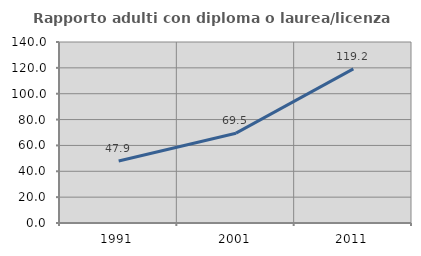
| Category | Rapporto adulti con diploma o laurea/licenza media  |
|---|---|
| 1991.0 | 47.893 |
| 2001.0 | 69.468 |
| 2011.0 | 119.219 |